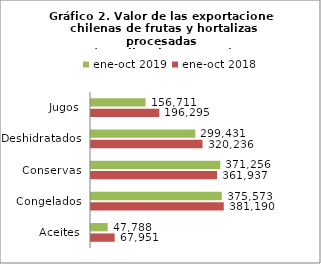
| Category | ene-oct 2018 | ene-oct 2019 |
|---|---|---|
| Aceites | 67951048.06 | 47787732.43 |
| Congelados | 381190030.01 | 375573005.04 |
| Conservas | 361937351.88 | 371255790.78 |
| Deshidratados | 320236132.49 | 299430751.1 |
| Jugos | 196295302.04 | 156710901.93 |